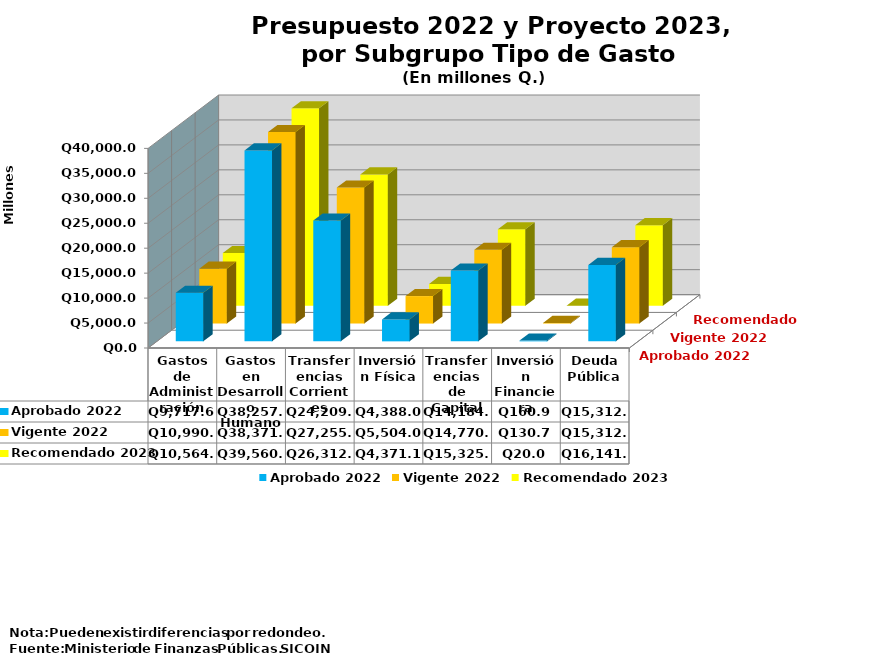
| Category | Aprobado 2022 | Vigente 2022 | Recomendado 2023 |
|---|---|---|---|
| Gastos de Administración | 9717.6 | 10990.1 | 10564.2 |
| Gastos en Desarrollo Humano | 38257 | 38371.3 | 39560.4 |
| Transferencias Corrientes | 24209.6 | 27255 | 26312.4 |
| Inversión Física | 4388 | 5504 | 4371.1 |
| Transferencias de Capital | 14184.4 | 14770.2 | 15325 |
| Inversión Financiera | 160.9 | 130.7 | 20 |
| Deuda Pública | 15312 | 15312 | 16141.7 |